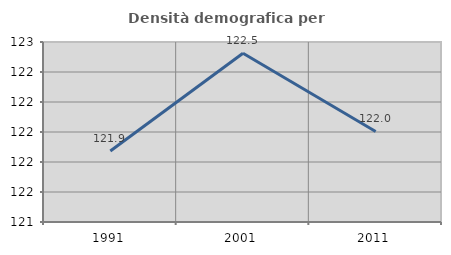
| Category | Densità demografica |
|---|---|
| 1991.0 | 121.873 |
| 2001.0 | 122.525 |
| 2011.0 | 122.004 |